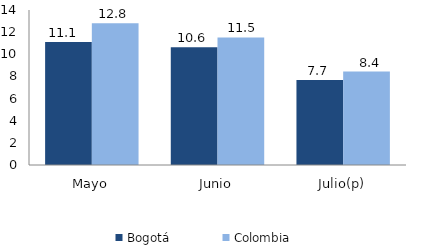
| Category | Bogotá | Colombia |
|---|---|---|
| Mayo | 11.119 | 12.805 |
| Junio | 10.633 | 11.521 |
| Julio(p) | 7.678 | 8.438 |